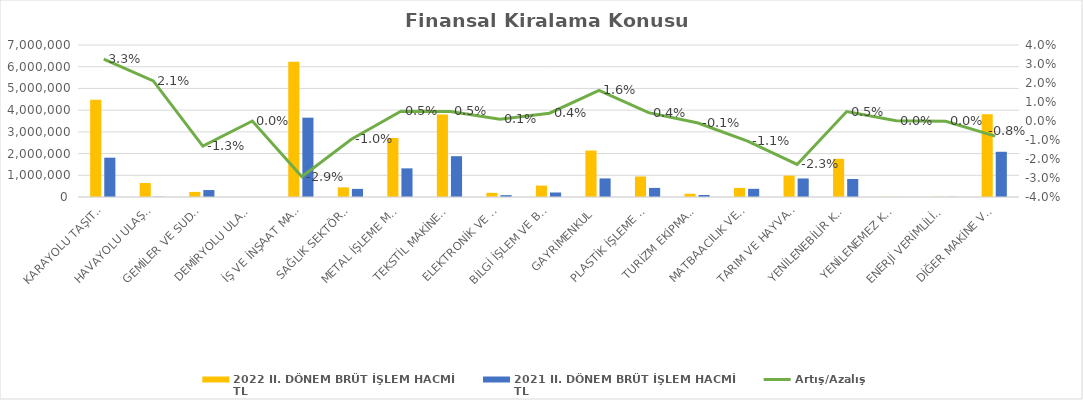
| Category | 2022 II. DÖNEM BRÜT İŞLEM HACMİ 
TL | 2021 II. DÖNEM BRÜT İŞLEM HACMİ 
TL |
|---|---|---|
| KARAYOLU TAŞITLARI | 4481193.914 | 1811135.997 |
| HAVAYOLU ULAŞIM ARAÇLARI | 643885 | 11001 |
| GEMİLER VE SUDA YÜZEN TAŞIT VE ARAÇLAR | 233742.45 | 320305.586 |
| DEMİRYOLU ULAŞIM ARAÇLARI | 0 | 0 |
| İŞ VE İNŞAAT MAKİNELERİ | 6234107.619 | 3653356.123 |
| SAĞLIK SEKTÖRÜ VE ESTETİK EKİPMANLARI | 443301.291 | 373993.543 |
| METAL İŞLEME MAKİNELERİ | 2715534.944 | 1318756.467 |
| TEKSTİL MAKİNELERİ | 3799704.912 | 1878793.638 |
| ELEKTRONİK VE OPTİK CİHAZLAR | 191675.012 | 83696.658 |
| BİLGİ İŞLEM VE BÜRO SİSTEMLERİ | 524994.362 | 207586.785 |
| GAYRİMENKUL | 2139214.991 | 856050.224 |
| PLASTİK İŞLEME MAKİNELERİ | 943798.476 | 419024.727 |
| TURİZM EKİPMANLARI | 148371.059 | 92221.875 |
| MATBAACILIK VE KAĞIT İŞLEME MAKİNELERİ | 418984.242 | 375645.664 |
| TARIM VE HAYVANCILIK MAKİNELERİ | 982892.781 | 852567.645 |
| YENİLENEBİLİR KAYNAKLI ELEKTRİK ENERJİSİ ÜRETİM EKİPMANLARI | 1758627.274 | 829377.181 |
| YENİLENEMEZ KAYNAKLI ELEKTRİK ENERJİSİ ÜRETİM EKİPMANLARI | 11337 | 2857 |
| ENERJİ VERİMLİLİĞİ EKİPMANLARI | 11273.342 | 8548.692 |
| DİĞER MAKİNE VE EKİPMANLAR | 3812181.107 | 2082720.629 |